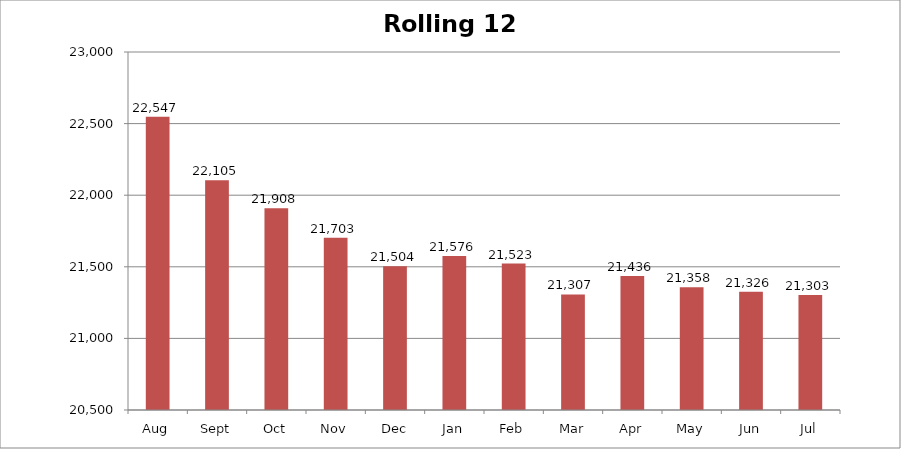
| Category | Rolling 12 Month |
|---|---|
| Aug | 22547 |
| Sept | 22105 |
| Oct | 21908 |
| Nov | 21703 |
| Dec | 21504 |
| Jan | 21576 |
| Feb | 21523 |
| Mar | 21307 |
| Apr | 21436 |
| May | 21358 |
| Jun | 21326 |
| Jul | 21303 |